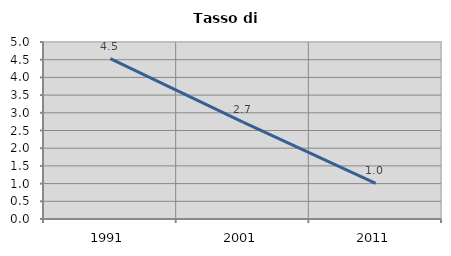
| Category | Tasso di disoccupazione   |
|---|---|
| 1991.0 | 4.533 |
| 2001.0 | 2.734 |
| 2011.0 | 1.009 |